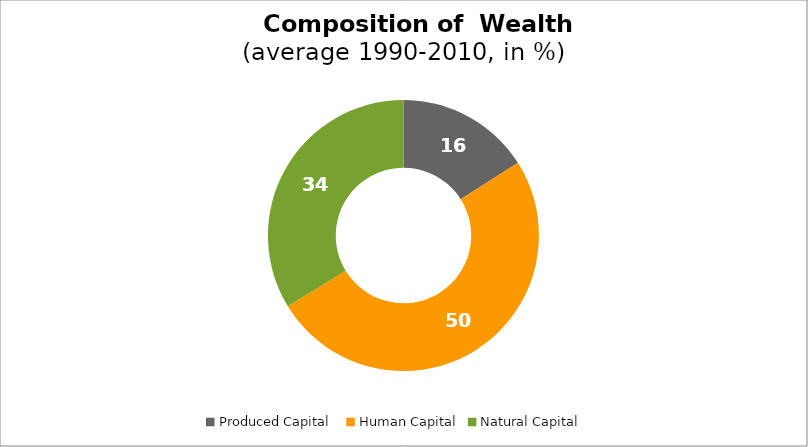
| Category | Series 0 |
|---|---|
| Produced Capital  | 15.995 |
| Human Capital | 50.269 |
| Natural Capital | 33.736 |